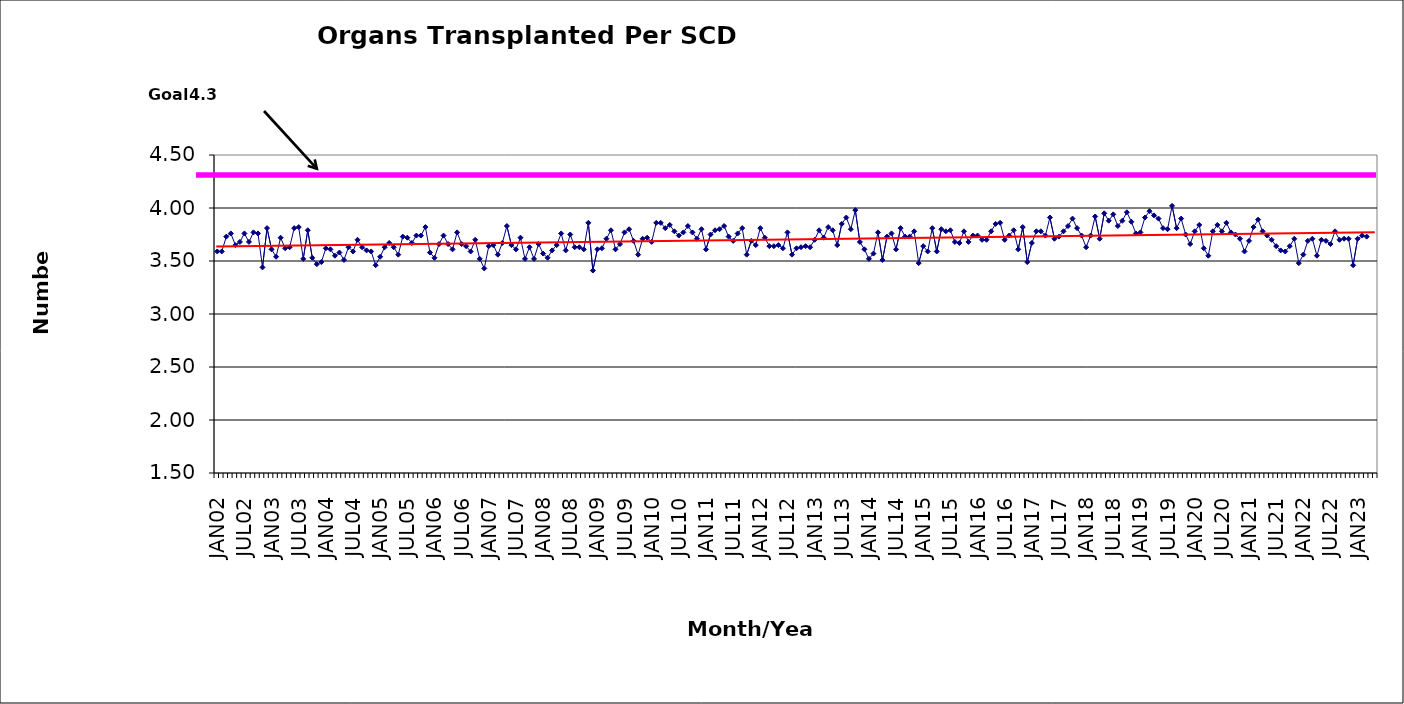
| Category | Series 0 |
|---|---|
| JAN02 | 3.59 |
| FEB02 | 3.59 |
| MAR02 | 3.73 |
| APR02 | 3.76 |
| MAY02 | 3.65 |
| JUN02 | 3.68 |
| JUL02 | 3.76 |
| AUG02 | 3.68 |
| SEP02 | 3.77 |
| OCT02 | 3.76 |
| NOV02 | 3.44 |
| DEC02 | 3.81 |
| JAN03 | 3.61 |
| FEB03 | 3.54 |
| MAR03 | 3.72 |
| APR03 | 3.62 |
| MAY03 | 3.63 |
| JUN03 | 3.81 |
| JUL03 | 3.82 |
| AUG03 | 3.52 |
| SEP03 | 3.79 |
| OCT03 | 3.53 |
| NOV03 | 3.47 |
| DEC03 | 3.49 |
| JAN04 | 3.62 |
| FEB04 | 3.61 |
| MAR04 | 3.55 |
| APR04 | 3.58 |
| MAY04 | 3.51 |
| JUN04 | 3.63 |
| JUL04 | 3.59 |
| AUG04 | 3.7 |
| SEP04 | 3.63 |
| OCT04 | 3.6 |
| NOV04 | 3.59 |
| DEC04 | 3.46 |
| JAN05 | 3.54 |
| FEB05 | 3.63 |
| MAR05 | 3.67 |
| APR05 | 3.63 |
| MAY05 | 3.56 |
| JUN05 | 3.73 |
| JUL05 | 3.72 |
| AUG05 | 3.67 |
| SEP05 | 3.74 |
| OCT05 | 3.74 |
| NOV05 | 3.82 |
| DEC05 | 3.58 |
| JAN06 | 3.53 |
| FEB06 | 3.66 |
| MAR06 | 3.74 |
| APR06 | 3.66 |
| MAY06 | 3.61 |
| JUN06 | 3.77 |
| JUL06 | 3.66 |
| AUG06 | 3.64 |
| SEP06 | 3.59 |
| OCT06 | 3.7 |
| NOV06 | 3.52 |
| DEC06 | 3.43 |
| JAN07 | 3.64 |
| FEB07 | 3.65 |
| MAR07 | 3.56 |
| APR07 | 3.67 |
| MAY07 | 3.83 |
| JUN07 | 3.65 |
| JUL07 | 3.61 |
| AUG07 | 3.72 |
| SEP07 | 3.52 |
| OCT07 | 3.63 |
| NOV07 | 3.52 |
| DEC07 | 3.66 |
| JAN08 | 3.57 |
| FEB08 | 3.53 |
| MAR08 | 3.6 |
| APR08 | 3.65 |
| MAY08 | 3.76 |
| JUN08 | 3.6 |
| JUL08 | 3.75 |
| AUG08 | 3.63 |
| SEP08 | 3.63 |
| OCT08 | 3.61 |
| NOV08 | 3.86 |
| DEC08 | 3.41 |
| JAN09 | 3.61 |
| FEB09 | 3.62 |
| MAR09 | 3.71 |
| APR09 | 3.79 |
| MAY09 | 3.61 |
| JUN09 | 3.66 |
| JUL09 | 3.77 |
| AUG09 | 3.8 |
| SEP09 | 3.69 |
| OCT09 | 3.56 |
| NOV09 | 3.71 |
| DEC09 | 3.72 |
| JAN10 | 3.68 |
| FEB10 | 3.86 |
| MAR10 | 3.86 |
| APR10 | 3.81 |
| MAY10 | 3.84 |
| JUN10 | 3.78 |
| JUL10 | 3.74 |
| AUG10 | 3.77 |
| SEP10 | 3.83 |
| OCT10 | 3.77 |
| NOV10 | 3.71 |
| DEC10 | 3.8 |
| JAN11 | 3.61 |
| FEB11 | 3.75 |
| MAR11 | 3.79 |
| APR11 | 3.8 |
| MAY11 | 3.83 |
| JUN11 | 3.73 |
| JUL11 | 3.69 |
| AUG11 | 3.76 |
| SEP11 | 3.81 |
| OCT11 | 3.56 |
| NOV11 | 3.69 |
| DEC11 | 3.65 |
| JAN12 | 3.81 |
| FEB12 | 3.72 |
| MAR12 | 3.64 |
| APR12 | 3.64 |
| MAY12 | 3.65 |
| JUN12 | 3.62 |
| JUL12 | 3.77 |
| AUG12 | 3.56 |
| SEP12 | 3.62 |
| OCT12 | 3.63 |
| NOV12 | 3.64 |
| DEC12 | 3.63 |
| JAN13 | 3.7 |
| FEB13 | 3.79 |
| MAR13 | 3.72 |
| APR13 | 3.82 |
| MAY13 | 3.79 |
| JUN13 | 3.65 |
| JUL13 | 3.85 |
| AUG13 | 3.91 |
| SEP13 | 3.8 |
| OCT13 | 3.98 |
| NOV13 | 3.68 |
| DEC13 | 3.61 |
| JAN14 | 3.52 |
| FEB14 | 3.57 |
| MAR14 | 3.77 |
| APR14 | 3.51 |
| MAY14 | 3.73 |
| JUN14 | 3.76 |
| JUL14 | 3.61 |
| AUG14 | 3.81 |
| SEP14 | 3.73 |
| OCT14 | 3.73 |
| NOV14 | 3.78 |
| DEC14 | 3.48 |
| JAN15 | 3.64 |
| FEB15 | 3.59 |
| MAR15 | 3.81 |
| APR15 | 3.59 |
| MAY15 | 3.8 |
| JUN15 | 3.78 |
| JUL15 | 3.79 |
| AUG15 | 3.68 |
| SEP15 | 3.67 |
| OCT15 | 3.78 |
| NOV15 | 3.68 |
| DEC15 | 3.74 |
| JAN16 | 3.74 |
| FEB16 | 3.7 |
| MAR16 | 3.7 |
| APR16 | 3.78 |
| MAY16 | 3.85 |
| JUN16 | 3.86 |
| JUL16 | 3.7 |
| AUG16 | 3.74 |
| SEP16 | 3.79 |
| OCT16 | 3.61 |
| NOV16 | 3.82 |
| DEC16 | 3.49 |
| JAN17 | 3.67 |
| FEB17 | 3.78 |
| MAR17 | 3.78 |
| APR17 | 3.74 |
| MAY17 | 3.91 |
| JUN17 | 3.71 |
| JUL17 | 3.73 |
| AUG17 | 3.78 |
| SEP17 | 3.83 |
| OCT17 | 3.9 |
| NOV17 | 3.81 |
| DEC17 | 3.74 |
| JAN18 | 3.63 |
| FEB18 | 3.74 |
| MAR18 | 3.92 |
| APR18 | 3.71 |
| MAY18 | 3.95 |
| JUN18 | 3.88 |
| JUL18 | 3.94 |
| AUG18 | 3.83 |
| SEP18 | 3.88 |
| OCT18 | 3.96 |
| NOV18 | 3.87 |
| DEC18 | 3.76 |
| JAN19 | 3.77 |
| FEB19 | 3.91 |
| MAR19 | 3.97 |
| APR19 | 3.93 |
| MAY19 | 3.9 |
| JUN19 | 3.81 |
| JUL19 | 3.8 |
| AUG19 | 4.02 |
| SEP19 | 3.81 |
| OCT19 | 3.9 |
| NOV19 | 3.75 |
| DEC19 | 3.66 |
| JAN20 | 3.78 |
| FEB20 | 3.84 |
| MAR20 | 3.62 |
| APR20 | 3.55 |
| MAY20 | 3.78 |
| JUN20 | 3.84 |
| JUL20 | 3.78 |
| AUG20 | 3.86 |
| SEP20 | 3.77 |
| OCT20 | 3.75 |
| NOV20 | 3.71 |
| DEC20 | 3.59 |
| JAN21 | 3.69 |
| FEB21 | 3.82 |
| MAR21 | 3.89 |
| APR21 | 3.78 |
| MAY21 | 3.74 |
| JUN21 | 3.7 |
| JUL21 | 3.64 |
| AUG21 | 3.6 |
| SEP21 | 3.59 |
| OCT21 | 3.64 |
| NOV21 | 3.71 |
| DEC21 | 3.48 |
| JAN22 | 3.56 |
| FEB22 | 3.69 |
| MAR22 | 3.71 |
| APR22 | 3.55 |
| MAY22 | 3.7 |
| JUN22 | 3.69 |
| JUL22 | 3.66 |
| AUG22 | 3.78 |
| SEP22 | 3.7 |
| OCT22 | 3.71 |
| NOV22 | 3.71 |
| DEC22 | 3.46 |
| JAN23 | 3.71 |
| FEB23 | 3.74 |
| MAR23 | 3.73 |